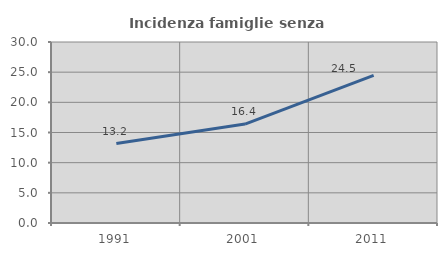
| Category | Incidenza famiglie senza nuclei |
|---|---|
| 1991.0 | 13.161 |
| 2001.0 | 16.401 |
| 2011.0 | 24.484 |